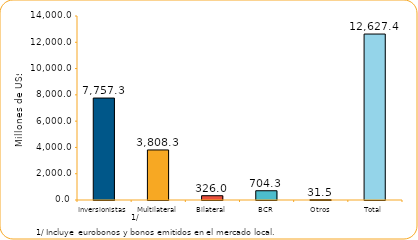
| Category | Series 1 |
|---|---|
| Inversionistas | 7757.3 |
| Multilateral | 3808.3 |
| Bilateral | 326 |
| BCR | 704.3 |
| Otros | 31.5 |
| Total | 12627.4 |